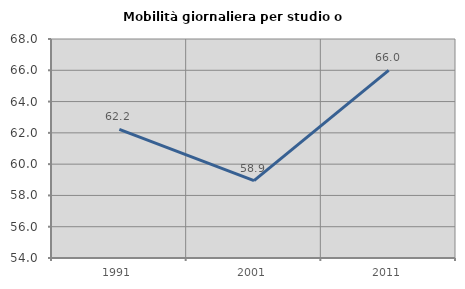
| Category | Mobilità giornaliera per studio o lavoro |
|---|---|
| 1991.0 | 62.22 |
| 2001.0 | 58.945 |
| 2011.0 | 65.989 |